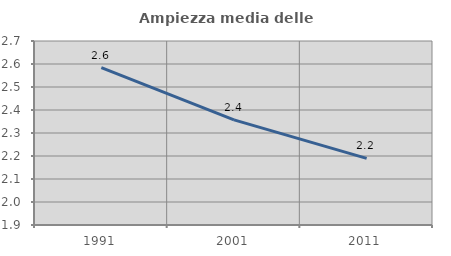
| Category | Ampiezza media delle famiglie |
|---|---|
| 1991.0 | 2.584 |
| 2001.0 | 2.357 |
| 2011.0 | 2.19 |